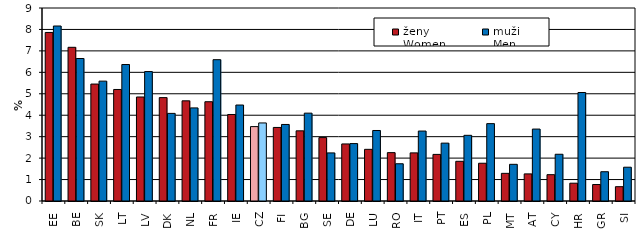
| Category | ženy
Women | muži
Men |
|---|---|---|
| EE | 7.859 | 8.16 |
| BE | 7.167 | 6.645 |
| SK | 5.453 | 5.59 |
| LT | 5.201 | 6.364 |
| LV | 4.85 | 6.035 |
| DK | 4.821 | 4.086 |
| NL | 4.671 | 4.341 |
| FR | 4.629 | 6.59 |
| IE | 4.034 | 4.475 |
| CZ | 3.469 | 3.64 |
| FI | 3.43 | 3.569 |
| BG | 3.272 | 4.097 |
| SE | 2.957 | 2.242 |
| DE | 2.661 | 2.678 |
| LU | 2.409 | 3.288 |
| RO | 2.256 | 1.737 |
| IT | 2.244 | 3.262 |
| PT | 2.173 | 2.698 |
| ES | 1.851 | 3.062 |
| PL | 1.761 | 3.608 |
| MT | 1.289 | 1.711 |
| AT | 1.264 | 3.355 |
| CY | 1.228 | 2.179 |
| HR | 0.83 | 5.059 |
| GR | 0.768 | 1.365 |
| SI | 0.668 | 1.576 |